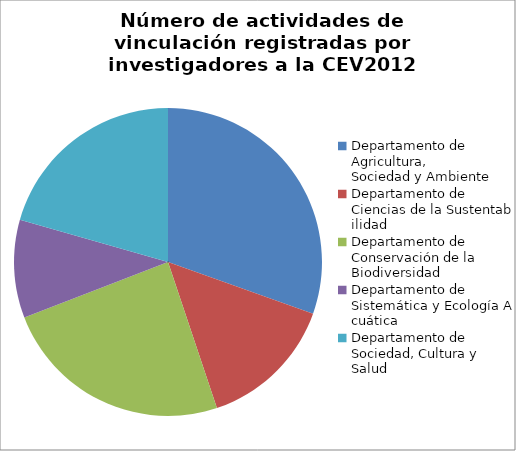
| Category | Número de actividades de vinculación |
|---|---|
| Departamento de Agricultura, Sociedad y Ambiente | 74 |
| Departamento de Ciencias de la Sustentabilidad | 35 |
| Departamento de Conservación de la Biodiversidad | 59 |
| Departamento de Sistemática y Ecología Acuática | 25 |
| Departamento de Sociedad, Cultura y Salud | 50 |